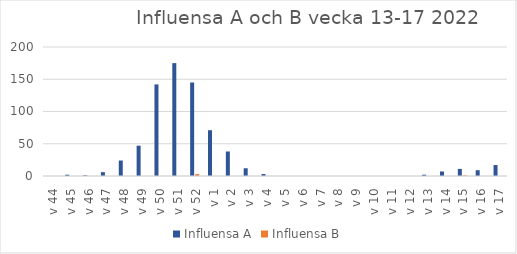
| Category | Influensa A | Influensa B |
|---|---|---|
| v 44 | 0 | 0 |
| v 45 | 2 | 0 |
| v 46 | 1 | 0 |
| v 47 | 6 | 0 |
| v 48 | 24 | 0 |
| v 49 | 47 | 0 |
| v 50 | 142 | 0 |
| v 51 | 175 | 0 |
| v 52 | 145 | 3 |
| v 1 | 71 | 0 |
| v 2 | 38 | 0 |
| v 3 | 12 | 0 |
| v 4 | 3 | 0 |
| v 5 | 0 | 0 |
| v 6 | 0 | 0 |
| v 7 | 0 | 0 |
| v 8 | 0 | 0 |
| v 9 | 0 | 0 |
| v 10 | 0 | 0 |
| v 11 | 0 | 0 |
| v 12 | 0 | 0 |
| v 13 | 2 | 0 |
| v 14 | 7 | 0 |
| v 15 | 11 | 1 |
| v 16 | 9 | 0 |
| v 17 | 17 | 0 |